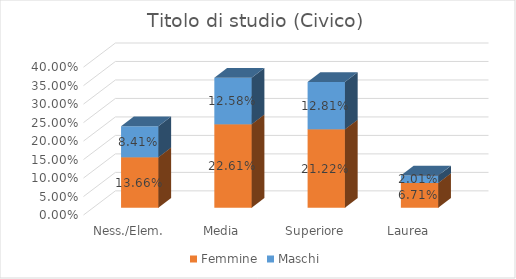
| Category | Femmine | Maschi |
|---|---|---|
| Ness./Elem. | 0.137 | 0.084 |
| Media | 0.226 | 0.126 |
| Superiore | 0.212 | 0.128 |
| Laurea | 0.067 | 0.02 |